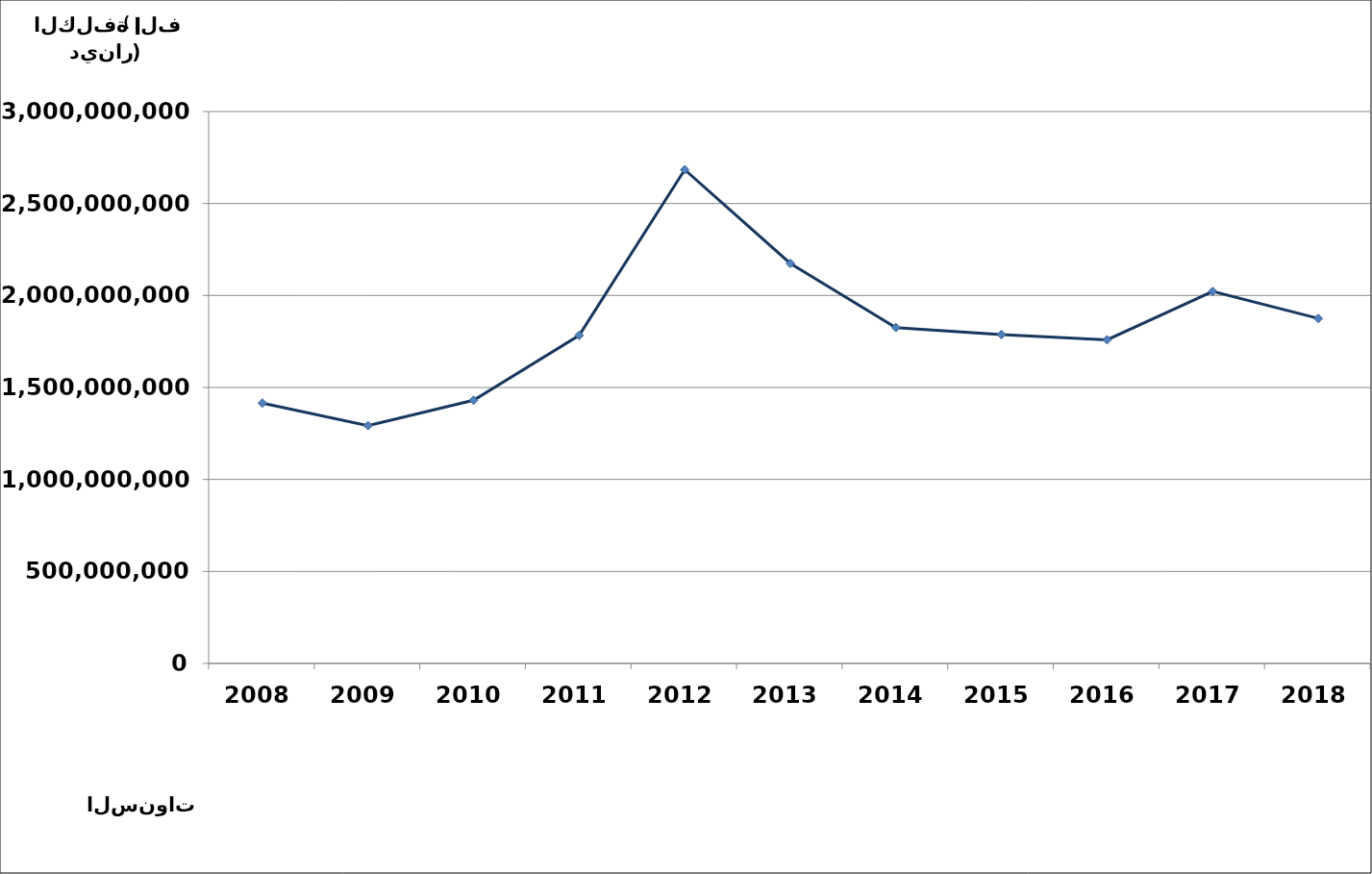
| Category | (الكلفة : الف دينار) |
|---|---|
| 2008.0 | 1415276080 |
| 2009.0 | 1292808839 |
| 2010.0 | 1430522910 |
| 2011.0 | 1782991128 |
| 2012.0 | 2683825044 |
| 2013.0 | 2174478040 |
| 2014.0 | 1825719741 |
| 2015.0 | 1788033926 |
| 2016.0 | 1759367319 |
| 2017.0 | 2021879215 |
| 2018.0 | 1875418667 |